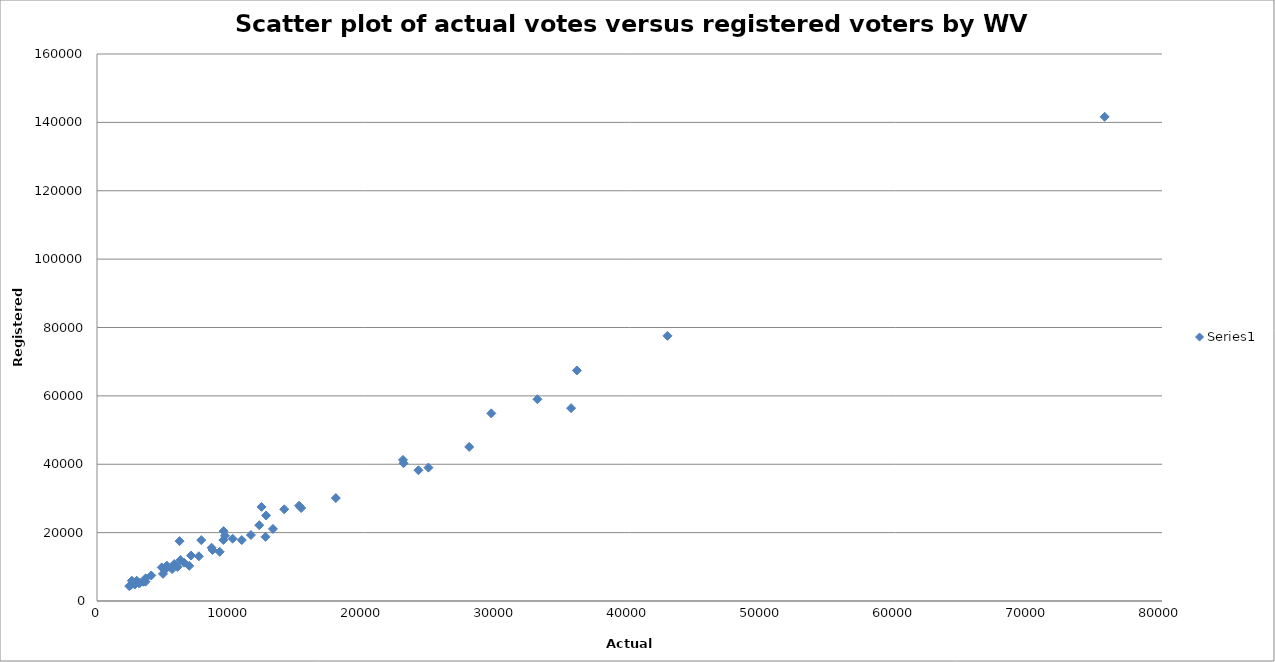
| Category | Series 0 |
|---|---|
| 6054.0 | 9984 |
| 42850.0 | 77563 |
| 8683.0 | 14908 |
| 5090.0 | 9067 |
| 9613.0 | 19079 |
| 33085.0 | 59010 |
| 2617.0 | 5939 |
| 2972.0 | 5891 |
| 2840.0 | 4811 |
| 15337.0 | 27196 |
| 2543.0 | 4661 |
| 4956.0 | 7937 |
| 14066.0 | 26831 |
| 8608.0 | 15578 |
| 12702.0 | 25010 |
| 5643.0 | 9324 |
| 27960.0 | 45067 |
| 12187.0 | 22173 |
| 24147.0 | 38245 |
| 75690.0 | 141639 |
| 6928.0 | 10278 |
| 7066.0 | 13295 |
| 12359.0 | 27523 |
| 23029.0 | 40293 |
| 13216.0 | 21078 |
| 10186.0 | 18225 |
| 6203.0 | 17511 |
| 22982.0 | 41266 |
| 11564.0 | 19297 |
| 9510.0 | 20452 |
| 36048.0 | 67438 |
| 5805.0 | 10818 |
| 7654.0 | 13088 |
| 9491.0 | 17838 |
| 17938.0 | 30114 |
| 3225.0 | 5316 |
| 3150.0 | 5205 |
| 3646.0 | 5644 |
| 12659.0 | 18772 |
| 24893.0 | 39015 |
| 29618.0 | 54884 |
| 10876.0 | 17817 |
| 4075.0 | 7465 |
| 5247.0 | 10349 |
| 4862.0 | 9817 |
| 6538.0 | 11208 |
| 3475.0 | 5626 |
| 3654.0 | 6628 |
| 9218.0 | 14386 |
| 15182.0 | 27872 |
| 2978.0 | 5917 |
| 6265.0 | 11968 |
| 2422.0 | 4351 |
| 35615.0 | 56415 |
| 7831.0 | 17805 |